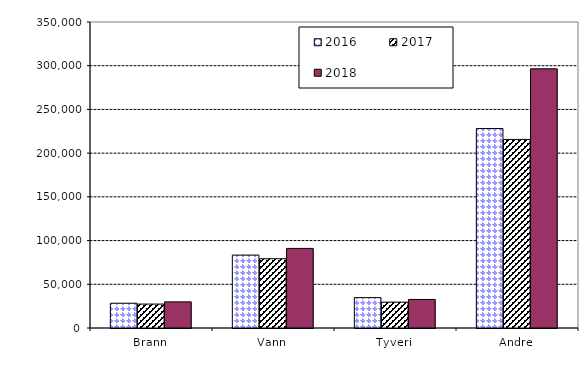
| Category | 2016 | 2017 | 2018 |
|---|---|---|---|
| Brann | 28310.174 | 27370.063 | 29882.201 |
| Vann | 83401.905 | 79211.787 | 91055.531 |
| Tyveri | 34730.615 | 29554.494 | 32661.24 |
| Andre | 228188.293 | 215684.233 | 296489.064 |